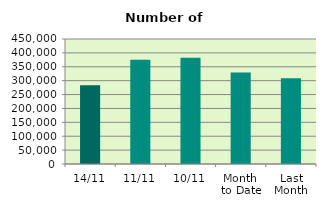
| Category | Series 0 |
|---|---|
| 14/11 | 283800 |
| 11/11 | 375396 |
| 10/11 | 382312 |
| Month 
to Date | 329374.8 |
| Last
Month | 308508.19 |